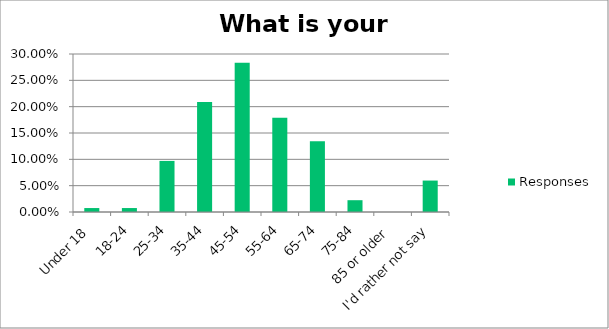
| Category | Responses |
|---|---|
| Under 18 | 0.008 |
| 18-24 | 0.008 |
| 25-34 | 0.097 |
| 35-44 | 0.209 |
| 45-54 | 0.284 |
| 55-64 | 0.179 |
| 65-74 | 0.134 |
| 75-84 | 0.022 |
| 85 or older | 0 |
| I'd rather not say | 0.06 |